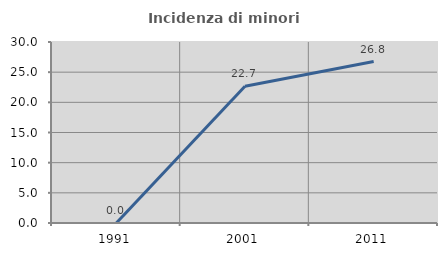
| Category | Incidenza di minori stranieri |
|---|---|
| 1991.0 | 0 |
| 2001.0 | 22.667 |
| 2011.0 | 26.768 |